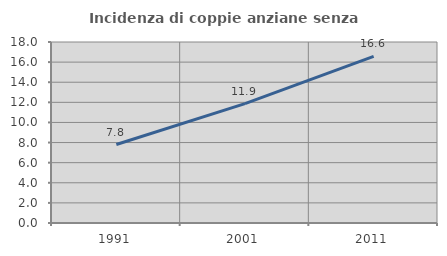
| Category | Incidenza di coppie anziane senza figli  |
|---|---|
| 1991.0 | 7.803 |
| 2001.0 | 11.874 |
| 2011.0 | 16.57 |